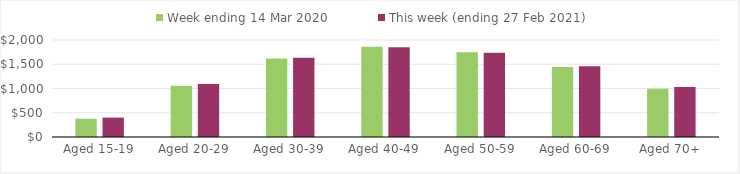
| Category | Week ending 14 Mar 2020 | This week (ending 27 Feb 2021) |
|---|---|---|
| Aged 15-19 | 377.15 | 399.32 |
| Aged 20-29 | 1058.64 | 1092.97 |
| Aged 30-39 | 1617.2 | 1634.03 |
| Aged 40-49 | 1860.29 | 1852.18 |
| Aged 50-59 | 1746.4 | 1738.49 |
| Aged 60-69 | 1442.9 | 1459.84 |
| Aged 70+ | 994.97 | 1033.25 |